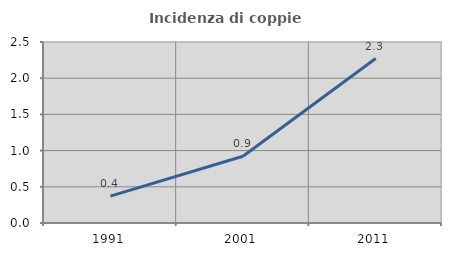
| Category | Incidenza di coppie miste |
|---|---|
| 1991.0 | 0.37 |
| 2001.0 | 0.922 |
| 2011.0 | 2.271 |